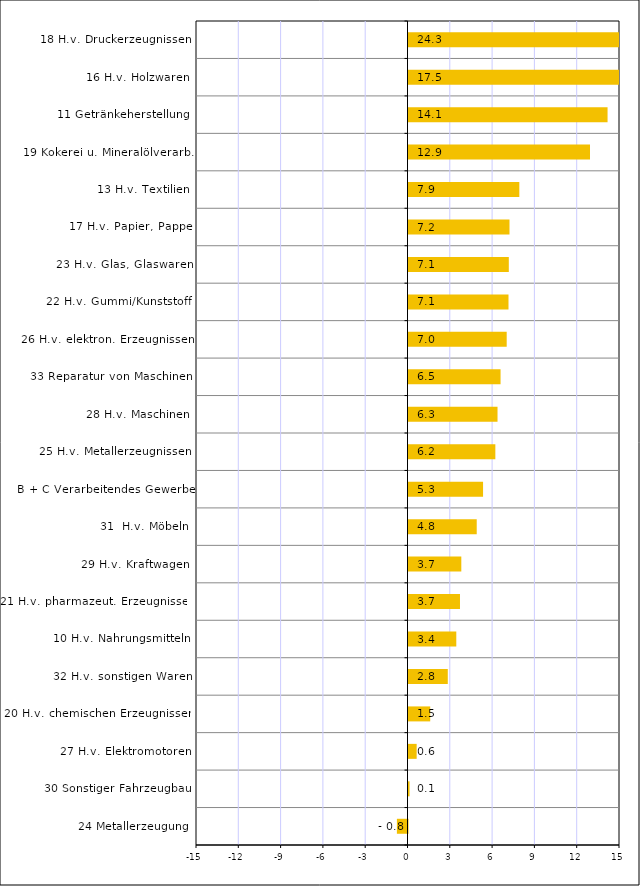
| Category | Series 0 |
|---|---|
| 24 Metallerzeugung | -0.753 |
| 30 Sonstiger Fahrzeugbau | 0.075 |
| 27 H.v. Elektromotoren | 0.579 |
| 20 H.v. chemischen Erzeugnissen | 1.539 |
| 32 H.v. sonstigen Waren | 2.786 |
| 10 H.v. Nahrungsmitteln | 3.389 |
| 21 H.v. pharmazeut. Erzeugnissen | 3.651 |
| 29 H.v. Kraftwagen | 3.745 |
| 31  H.v. Möbeln | 4.839 |
| B + C Verarbeitendes Gewerbe | 5.288 |
| 25 H.v. Metallerzeugnissen | 6.159 |
| 28 H.v. Maschinen | 6.314 |
| 33 Reparatur von Maschinen | 6.529 |
| 26 H.v. elektron. Erzeugnissen | 6.964 |
| 22 H.v. Gummi/Kunststoff | 7.092 |
| 23 H.v. Glas, Glaswaren | 7.114 |
| 17 H.v. Papier, Pappe | 7.162 |
| 13 H.v. Textilien | 7.86 |
| 19 Kokerei u. Mineralölverarb. | 12.872 |
| 11 Getränkeherstellung | 14.118 |
| 16 H.v. Holzwaren | 17.493 |
| 18 H.v. Druckerzeugnissen | 24.345 |